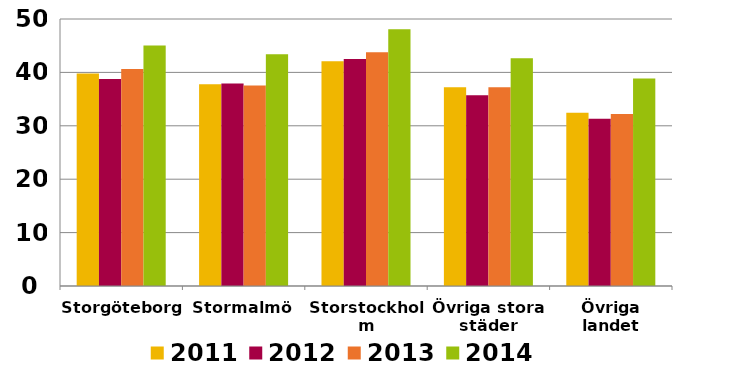
| Category | 2011 | 2012 | 2013 | 2014 |
|---|---|---|---|---|
| Storgöteborg | 39.814 | 38.741 | 40.632 | 45.016 |
| Stormalmö | 37.759 | 37.899 | 37.545 | 43.418 |
| Storstockholm | 42.076 | 42.51 | 43.762 | 48.075 |
| Övriga stora städer | 37.205 | 35.721 | 37.208 | 42.669 |
| Övriga landet | 32.463 | 31.326 | 32.222 | 38.863 |